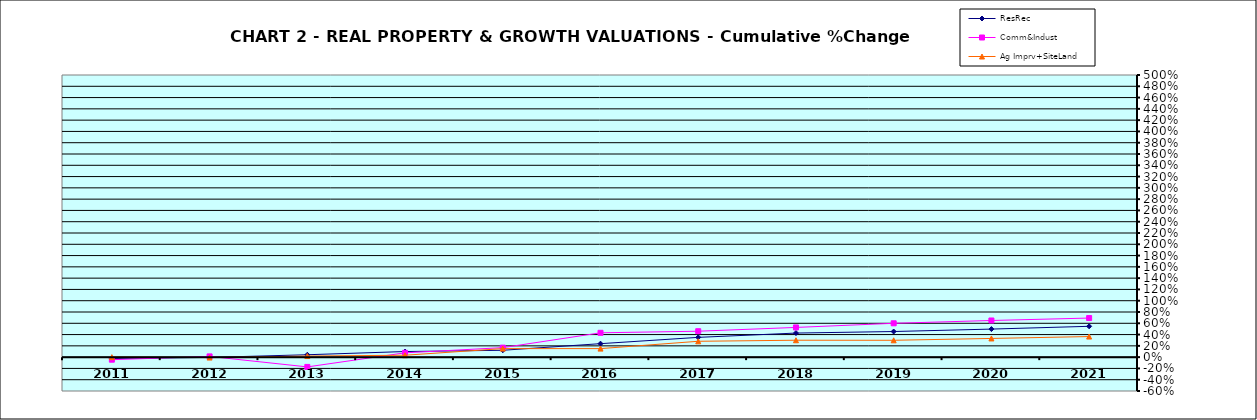
| Category | ResRec | Comm&Indust | Ag Imprv+SiteLand |
|---|---|---|---|
| 2011.0 | -0.023 | -0.045 | 0 |
| 2012.0 | -0.005 | 0.013 | -0.007 |
| 2013.0 | 0.042 | -0.173 | 0.019 |
| 2014.0 | 0.099 | 0.077 | 0.034 |
| 2015.0 | 0.122 | 0.169 | 0.151 |
| 2016.0 | 0.239 | 0.431 | 0.151 |
| 2017.0 | 0.351 | 0.46 | 0.281 |
| 2018.0 | 0.427 | 0.527 | 0.3 |
| 2019.0 | 0.454 | 0.6 | 0.299 |
| 2020.0 | 0.497 | 0.649 | 0.331 |
| 2021.0 | 0.546 | 0.693 | 0.365 |